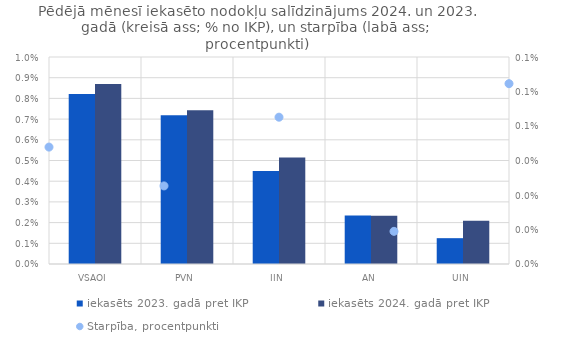
| Category | iekasēts 2023. gadā pret IKP | iekasēts 2024. gadā pret IKP |
|---|---|---|
| VSAOI | 0.008 | 0.009 |
| PVN | 0.007 | 0.007 |
| IIN | 0.004 | 0.005 |
| AN | 0.002 | 0.002 |
| UIN | 0.001 | 0.002 |